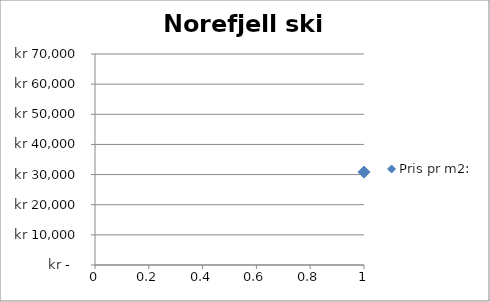
| Category | Pris pr m2: |
|---|---|
| 0 | 30814 |
| 1 | 50862 |
| 2 | 31535 |
| 3 | 48182 |
| 4 | 31513 |
| 5 | 32955 |
| 6 | 32222 |
| 7 | 65000 |
| 8 | 30636 |
| 9 | 38000 |
| 10 | 29730 |
| 11 | 36735 |
| 12 | 38953 |
| 13 | 23113 |
| 14 | 37079 |
| 15 | 39015 |
| 16 | 29822 |
| 17 | 33636 |
| 18 | 31579 |
| 19 | 31579 |
| 20 | 29609 |
| 21 | 64607 |
| 22 | 23256 |
| 23 | 38750 |
| 24 | 38835 |
| 25 | 27941 |
| 26 | 30000 |
| 27 | 14104 |
| 28 | 50000 |
| 29 | 27850 |
| 30 | 36458 |
| 31 | 28440 |
| 32 | 27835 |
| 33 | 35096 |
| 34 | 36979 |
| 35 | 38462 |
| 36 | 32558 |
| 37 | 35211 |
| 38 | 15693 |
| 39 | 35333 |
| 40 | 35333 |
| 41 | 48469 |
| 42 | 37500 |
| 43 | 37500 |
| 44 | 29213 |
| 45 | 27778 |
| 46 | 24855 |
| 47 | 28208 |
| 48 | 44538 |
| 49 | 44538 |
| 50 | 34694 |
| 51 | 46429 |
| 52 | 36667 |
| 53 | 36667 |
| 54 | 44286 |
| 55 | 30172 |
| 56 | 30000 |
| 57 | 30000 |
| 58 | 15693 |
| 59 | 61570 |
| 60 | 39773 |
| 61 | 34762 |
| 62 | 41406 |
| 63 | 35540 |
| 64 | 35540 |
| 65 | 33750 |
| 66 | 34000 |
| 67 | 41071 |
| 68 | 41071 |
| 69 | 17245 |
| 70 | 26136 |
| 71 | 34426 |
| 72 | 21187 |
| 73 | 37766 |
| 74 | 64286 |
| 75 | 49438 |
| 76 | 33333 |
| 77 | 41958 |
| 78 | 35676 |
| 79 | 35246 |
| 80 | 53061 |
| 81 | 25581 |
| 82 | 19328 |
| 83 | 29412 |
| 84 | 48408 |
| 85 | 35111 |
| 86 | 30743 |
| 87 | 43391 |
| 88 | 43391 |
| 89 | 26864 |
| 90 | 40789 |
| 91 | 40789 |
| 92 | 39063 |
| 93 | 43333 |
| 94 | 43333 |
| 95 | 48347 |
| 96 | 40000 |
| 97 | 42742 |
| 98 | 42742 |
| 99 | 41447 |
| 100 | 41447 |
| 101 | 43333 |
| 102 | 43333 |
| 103 | 51200 |
| 104 | 51200 |
| 105 | 37920 |
| 106 | 37920 |
| 107 | 32659 |
| 108 | 39737 |
| 109 | 39737 |
| 110 | 34694 |
| 111 | 24528 |
| 112 | 37421 |
| 113 | 37421 |
| 114 | 30435 |
| 115 | 27273 |
| 116 | 33712 |
| 117 | 35676 |
| 118 | 26899 |
| 119 | 40789 |
| 120 | 40789 |
| 121 | 46071 |
| 122 | 46071 |